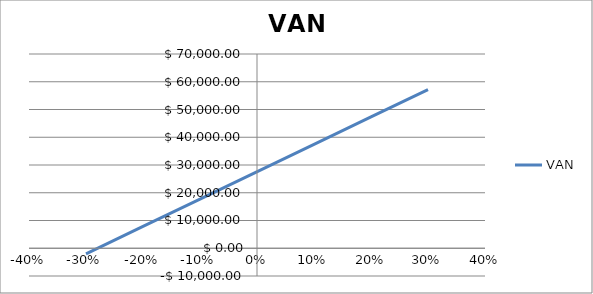
| Category | VAN |
|---|---|
| 0.3 | 57181.14 |
| 0.2 | 47314.82 |
| 0.1 | 37448.49 |
| -0.1 | 17715.84 |
| -0.2 | 7849.51 |
| -0.3 | -2016.81 |